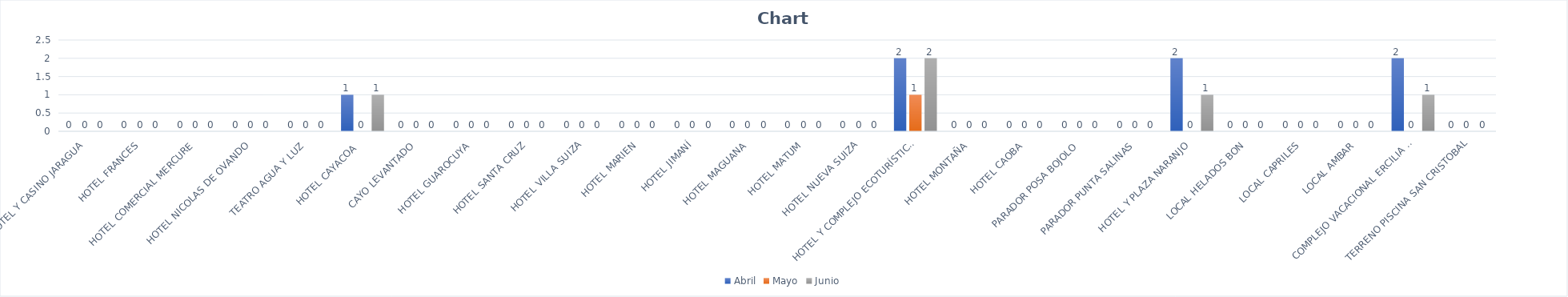
| Category | Abril | Mayo | Junio |
|---|---|---|---|
| HOTEL Y CASINO JARAGUA | 0 | 0 | 0 |
| HOTEL FRANCES | 0 | 0 | 0 |
| HOTEL COMERCIAL MERCURE | 0 | 0 | 0 |
| HOTEL NICOLAS DE OVANDO | 0 | 0 | 0 |
| TEATRO AGUA Y LUZ | 0 | 0 | 0 |
| HOTEL CAYACOA  | 1 | 0 | 1 |
| CAYO LEVANTADO | 0 | 0 | 0 |
| HOTEL GUAROCUYA | 0 | 0 | 0 |
| HOTEL SANTA CRUZ | 0 | 0 | 0 |
| HOTEL VILLA SUIZA | 0 | 0 | 0 |
| HOTEL MARIEN | 0 | 0 | 0 |
| HOTEL JIMANÍ | 0 | 0 | 0 |
| HOTEL MAGUANA | 0 | 0 | 0 |
| HOTEL MATUM | 0 | 0 | 0 |
| HOTEL NUEVA SUIZA | 0 | 0 | 0 |
| HOTEL Y COMPLEJO ECOTURÍSTICO LA MANSIÓN | 2 | 1 | 2 |
| HOTEL MONTAÑA | 0 | 0 | 0 |
| HOTEL CAOBA | 0 | 0 | 0 |
| PARADOR POSA BOJOLO | 0 | 0 | 0 |
| PARADOR PUNTA SALINAS | 0 | 0 | 0 |
| HOTEL Y PLAZA NARANJO | 2 | 0 | 1 |
| LOCAL HELADOS BON | 0 | 0 | 0 |
| LOCAL CAPRILES | 0 | 0 | 0 |
| LOCAL AMBAR | 0 | 0 | 0 |
| COMPLEJO VACACIONAL ERCILIA PEPÍN | 2 | 0 | 1 |
| TERRENO PISCINA SAN CRISTOBAL | 0 | 0 | 0 |